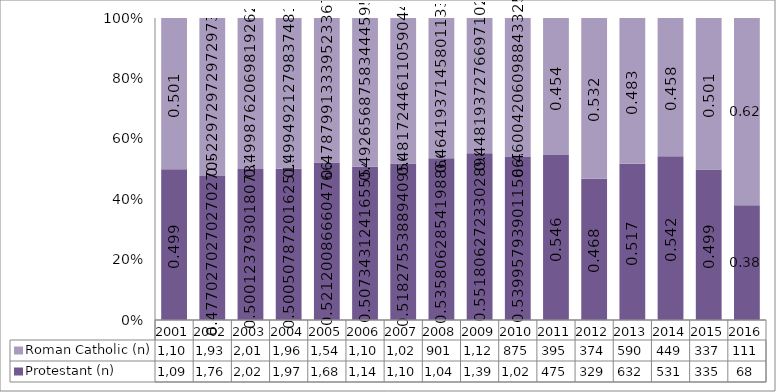
| Category | Protestant (n) | Roman Catholic (n) |
|---|---|---|
| 2001.0 | 1097 | 1100 |
| 2002.0 | 1765 | 1935 |
| 2003.0 | 2020 | 2019 |
| 2004.0 | 1971 | 1967 |
| 2005.0 | 1684 | 1547 |
| 2006.0 | 1140 | 1107 |
| 2007.0 | 1106 | 1028 |
| 2008.0 | 1040 | 901 |
| 2009.0 | 1390 | 1129 |
| 2010.0 | 1027 | 875 |
| 2011.0 | 475 | 395 |
| 2012.0 | 329 | 374 |
| 2013.0 | 632 | 590 |
| 2014.0 | 531 | 449 |
| 2015.0 | 335 | 337 |
| 2016.0 | 68 | 111 |